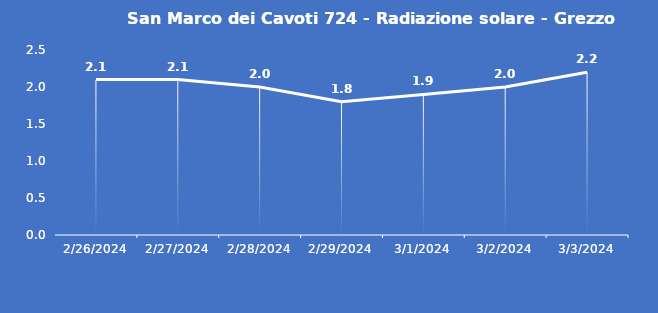
| Category | San Marco dei Cavoti 724 - Radiazione solare - Grezzo (W/m2) |
|---|---|
| 2/26/24 | 2.1 |
| 2/27/24 | 2.1 |
| 2/28/24 | 2 |
| 2/29/24 | 1.8 |
| 3/1/24 | 1.9 |
| 3/2/24 | 2 |
| 3/3/24 | 2.2 |